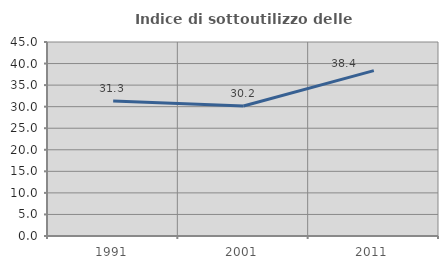
| Category | Indice di sottoutilizzo delle abitazioni  |
|---|---|
| 1991.0 | 31.325 |
| 2001.0 | 30.169 |
| 2011.0 | 38.365 |